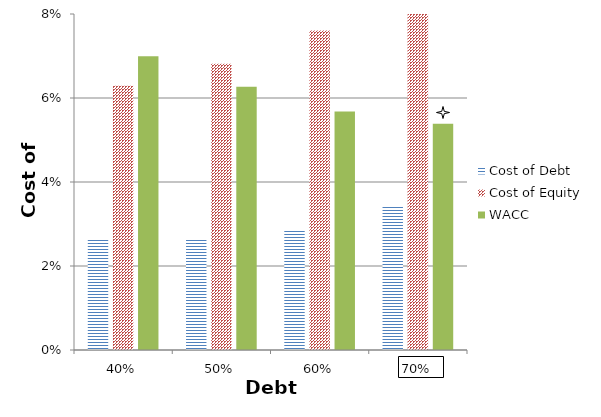
| Category | Cost of Debt | Cost of Equity | WACC |
|---|---|---|---|
| 0.4 | 0.026 | 0.063 | 0.07 |
| 0.5 | 0.026 | 0.068 | 0.063 |
| 0.6 | 0.029 | 0.076 | 0.057 |
| 0.7 | 0.035 | 0.089 | 0.054 |